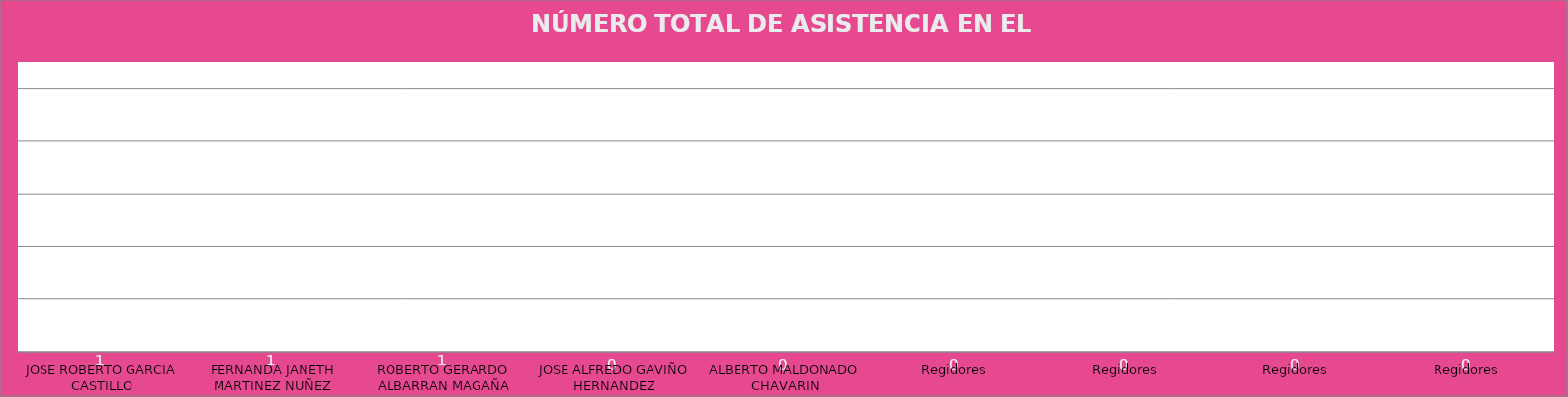
| Category | JOSE ROBERTO GARCIA CASTILLO |
|---|---|
| JOSE ROBERTO GARCIA CASTILLO | 1 |
| FERNANDA JANETH MARTINEZ NUÑEZ | 1 |
| ROBERTO GERARDO ALBARRAN MAGAÑA | 1 |
| JOSE ALFREDO GAVIÑO HERNANDEZ | 0 |
| ALBERTO MALDONADO CHAVARIN | 0 |
| Regidores | 0 |
| Regidores | 0 |
| Regidores | 0 |
| Regidores | 0 |